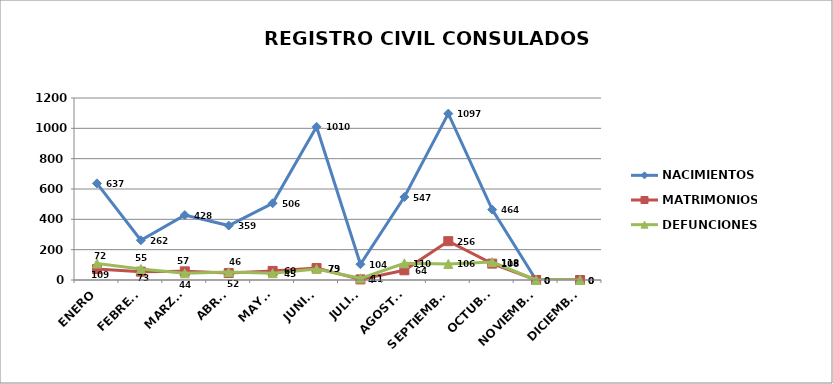
| Category | NACIMIENTOS | MATRIMONIOS | DEFUNCIONES |
|---|---|---|---|
| ENERO | 637 | 72 | 109 |
| FEBRERO | 262 | 55 | 73 |
| MARZO | 428 | 57 | 44 |
| ABRIL | 359 | 46 | 52 |
| MAYO | 506 | 60 | 45 |
| JUNIO | 1010 | 79 | 73 |
| JULIO | 104 | 4 | 11 |
| AGOSTO | 547 | 64 | 110 |
| SEPTIEMBRE | 1097 | 256 | 106 |
| OCTUBRE | 464 | 108 | 118 |
| NOVIEMBRE | 0 | 0 | 0 |
| DICIEMBRE | 0 | 0 | 0 |